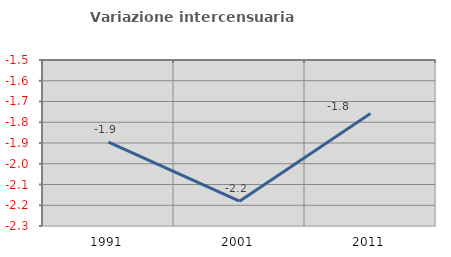
| Category | Variazione intercensuaria annua |
|---|---|
| 1991.0 | -1.895 |
| 2001.0 | -2.181 |
| 2011.0 | -1.757 |